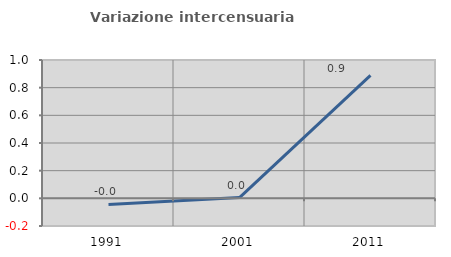
| Category | Variazione intercensuaria annua |
|---|---|
| 1991.0 | -0.044 |
| 2001.0 | 0.006 |
| 2011.0 | 0.888 |